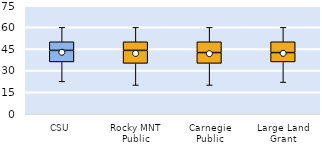
| Category | 25th | 50th | 75th |
|---|---|---|---|
| CSU | 36 | 8 | 6 |
| Rocky MNT Public | 35 | 9 | 6 |
| Carnegie Public | 35 | 7.5 | 7.5 |
| Large Land Grant | 36 | 6.5 | 7.5 |